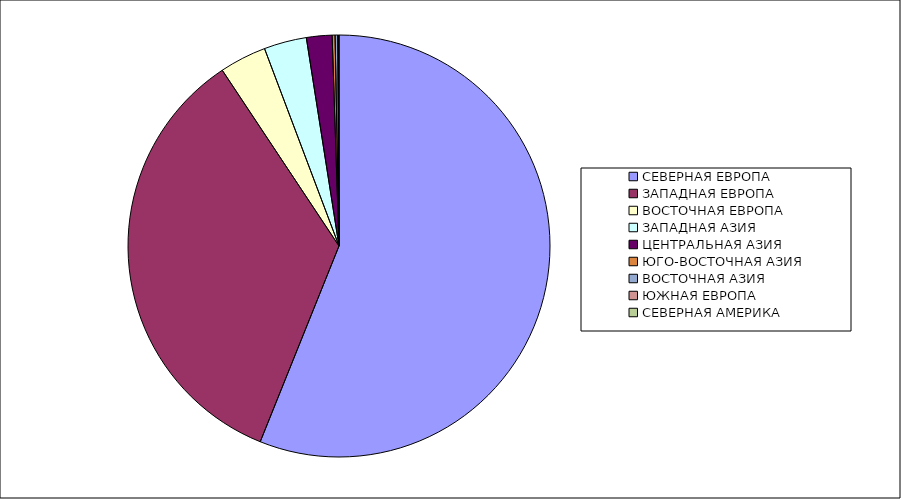
| Category | Оборот |
|---|---|
| СЕВЕРНАЯ ЕВРОПА | 56.089 |
| ЗАПАДНАЯ ЕВРОПА | 34.578 |
| ВОСТОЧНАЯ ЕВРОПА | 3.592 |
| ЗАПАДНАЯ АЗИЯ | 3.263 |
| ЦЕНТРАЛЬНАЯ АЗИЯ | 1.96 |
| ЮГО-ВОСТОЧНАЯ АЗИЯ | 0.224 |
| ВОСТОЧНАЯ АЗИЯ | 0.204 |
| ЮЖНАЯ ЕВРОПА | 0.065 |
| СЕВЕРНАЯ АМЕРИКА | 0.026 |